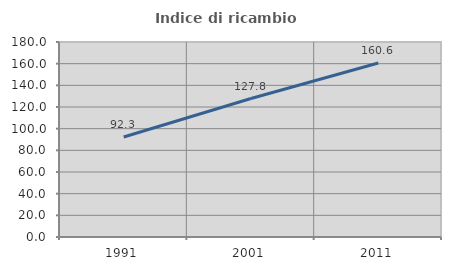
| Category | Indice di ricambio occupazionale  |
|---|---|
| 1991.0 | 92.332 |
| 2001.0 | 127.82 |
| 2011.0 | 160.577 |